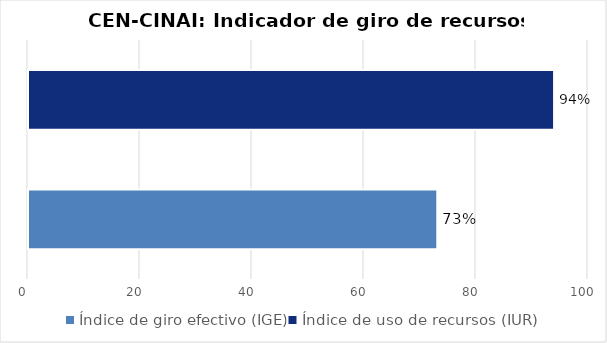
| Category | Series 0 |
|---|---|
| Índice de giro efectivo (IGE) | 73.087 |
| Índice de uso de recursos (IUR)  | 93.943 |